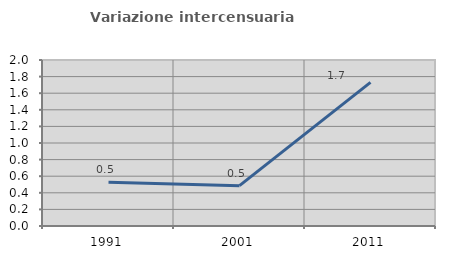
| Category | Variazione intercensuaria annua |
|---|---|
| 1991.0 | 0.528 |
| 2001.0 | 0.486 |
| 2011.0 | 1.73 |